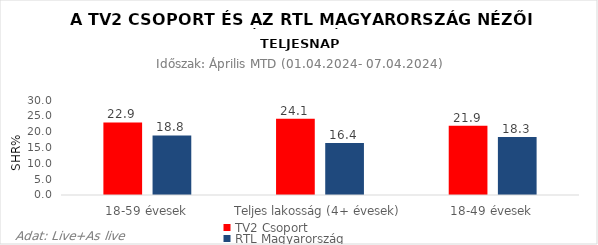
| Category | TV2 Csoport | RTL Magyarország |
|---|---|---|
| 18-59 évesek | 22.9 | 18.8 |
| Teljes lakosság (4+ évesek) | 24.1 | 16.4 |
| 18-49 évesek | 21.9 | 18.3 |